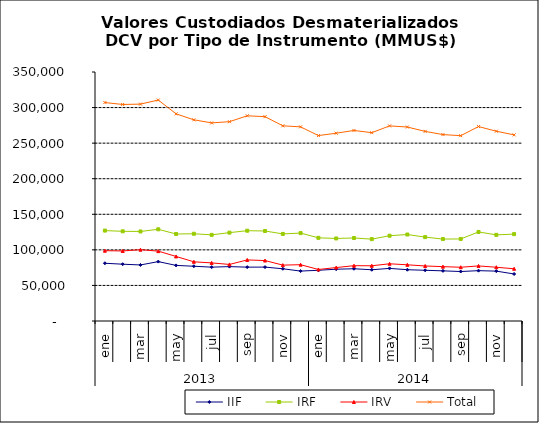
| Category | IIF | IRF | IRV | Total |
|---|---|---|---|---|
| 0 | 81170.83 | 127081.919 | 98829.931 | 307082.68 |
| 1900-01-01 | 79839.053 | 126045.699 | 98462.561 | 304347.313 |
| 1900-01-02 | 78761.309 | 125861.366 | 100231.491 | 304854.166 |
| 1900-01-03 | 83465.037 | 128907.337 | 98211.779 | 310584.153 |
| 1900-01-04 | 78146.718 | 122273.492 | 90743.924 | 291164.134 |
| 1900-01-05 | 76965.203 | 122620.135 | 83206.996 | 282792.334 |
| 1900-01-06 | 75705.094 | 121074.576 | 81675.524 | 278455.193 |
| 1900-01-07 | 76454.342 | 124205.399 | 79486.55 | 280146.291 |
| 1900-01-08 | 75689.196 | 126922.9 | 85843.524 | 288455.62 |
| 1900-01-09 | 75762.957 | 126506.803 | 84955.045 | 287224.805 |
| 1900-01-10 | 73416.27 | 122390.016 | 78541.4 | 274347.685 |
| 1900-01-11 | 70158.893 | 123578.501 | 79143.198 | 272880.592 |
| 1900-01-12 | 71304.608 | 116905.607 | 72428.139 | 260638.354 |
| 1900-01-13 | 72797.002 | 116027.828 | 75132.114 | 263956.944 |
| 1900-01-14 | 73424.667 | 116679.392 | 77731.156 | 267835.215 |
| 1900-01-15 | 72028.533 | 115064.201 | 77628.794 | 264721.528 |
| 1900-01-16 | 73950.393 | 119889.261 | 80406.314 | 274245.968 |
| 1900-01-17 | 72092.502 | 121561.686 | 78989.531 | 272643.72 |
| 1900-01-18 | 71285.955 | 117899.51 | 77341.332 | 266526.797 |
| 1900-01-19 | 70483.419 | 115155.469 | 76395.904 | 262034.791 |
| 1900-01-20 | 69552.801 | 115362.038 | 75568.341 | 260483.18 |
| 1900-01-21 | 70744.772 | 125159.405 | 77399.09 | 273303.267 |
| 1900-01-22 | 70097.098 | 121098.821 | 75561.326 | 266757.246 |
| 1900-01-23 | 66090.561 | 122122.709 | 73395.251 | 261608.521 |